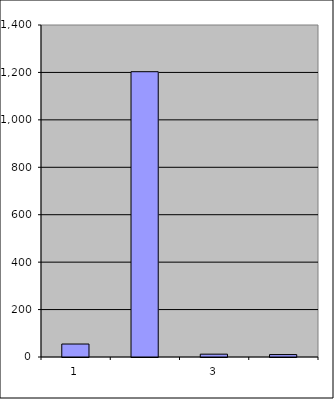
| Category | Series 0 |
|---|---|
| 0 | 54.75 |
| 1 | 1203.04 |
| 2 | 11.943 |
| 3 | 10.274 |